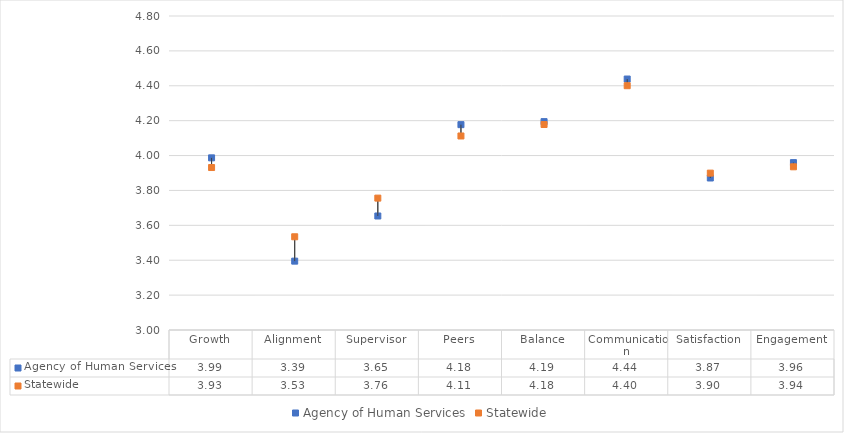
| Category | Agency of Human Services | Statewide |
|---|---|---|
| Growth | 3.987 | 3.931 |
| Alignment | 3.395 | 3.534 |
| Supervisor | 3.654 | 3.756 |
| Peers | 4.177 | 4.112 |
| Balance | 4.194 | 4.178 |
| Communication | 4.439 | 4.4 |
| Satisfaction | 3.871 | 3.899 |
| Engagement | 3.96 | 3.936 |